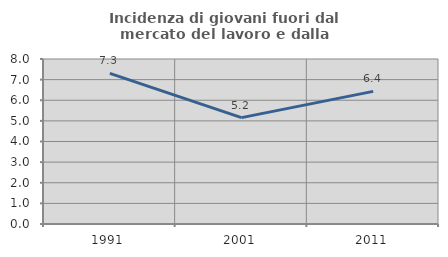
| Category | Incidenza di giovani fuori dal mercato del lavoro e dalla formazione  |
|---|---|
| 1991.0 | 7.299 |
| 2001.0 | 5.158 |
| 2011.0 | 6.43 |